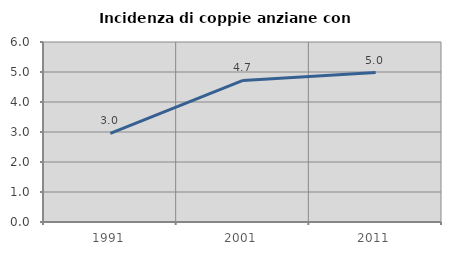
| Category | Incidenza di coppie anziane con figli |
|---|---|
| 1991.0 | 2.956 |
| 2001.0 | 4.719 |
| 2011.0 | 4.98 |